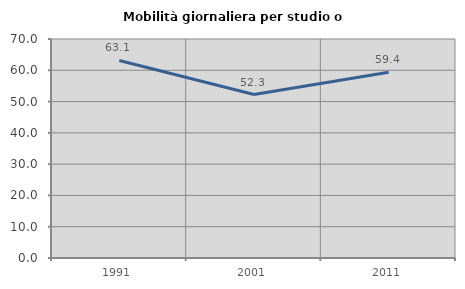
| Category | Mobilità giornaliera per studio o lavoro |
|---|---|
| 1991.0 | 63.134 |
| 2001.0 | 52.252 |
| 2011.0 | 59.387 |